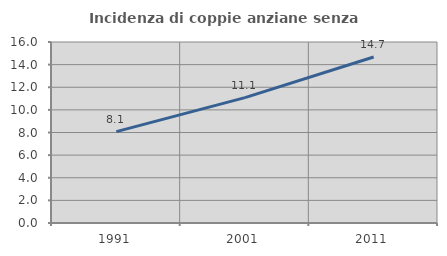
| Category | Incidenza di coppie anziane senza figli  |
|---|---|
| 1991.0 | 8.075 |
| 2001.0 | 11.082 |
| 2011.0 | 14.676 |